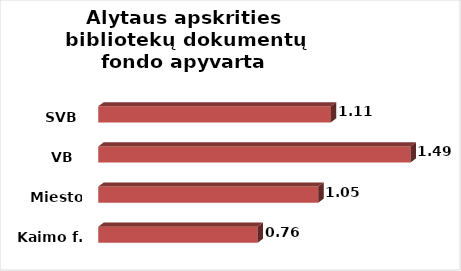
| Category | Series 0 |
|---|---|
| Kaimo f. | 0.76 |
| Miesto f. | 1.05 |
| VB  | 1.49 |
| SVB | 1.11 |